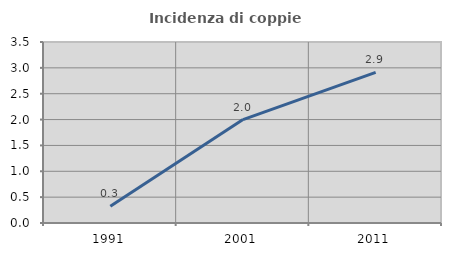
| Category | Incidenza di coppie miste |
|---|---|
| 1991.0 | 0.324 |
| 2001.0 | 2 |
| 2011.0 | 2.914 |